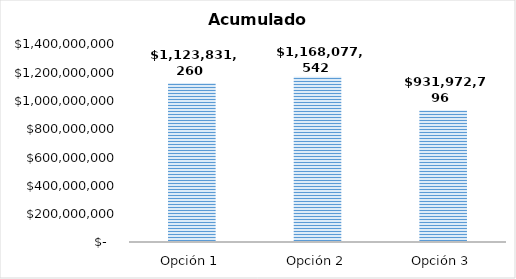
| Category | Acumulado [USD] |
|---|---|
| Opción 1 | 1123831260.242 |
| Opción 2 | 1168077541.858 |
| Opción 3 | 931972796.491 |